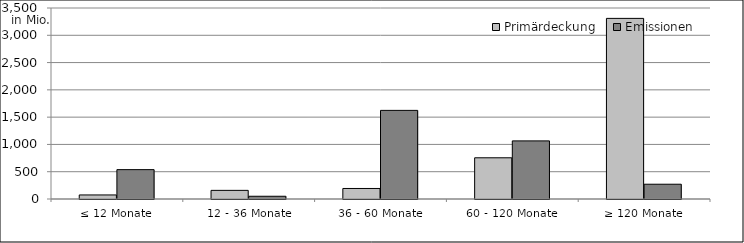
| Category | Primärdeckung | Emissionen |
|---|---|---|
| ≤ 12 Monate | 74388266.734 | 538000000 |
| 12 - 36 Monate | 158328671.913 | 50150000 |
| 36 - 60 Monate | 192782021.04 | 1624000000 |
| 60 - 120 Monate | 755294491.43 | 1065000000 |
| ≥ 120 Monate | 3309623400.86 | 270837120.77 |